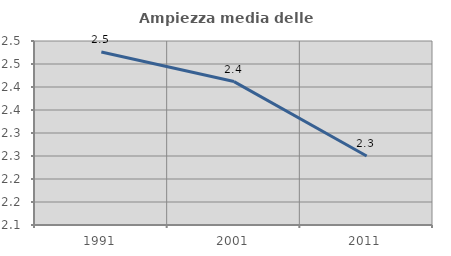
| Category | Ampiezza media delle famiglie |
|---|---|
| 1991.0 | 2.476 |
| 2001.0 | 2.412 |
| 2011.0 | 2.25 |